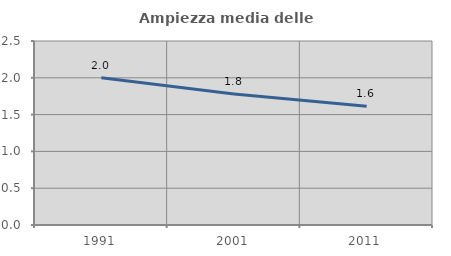
| Category | Ampiezza media delle famiglie |
|---|---|
| 1991.0 | 2 |
| 2001.0 | 1.78 |
| 2011.0 | 1.613 |